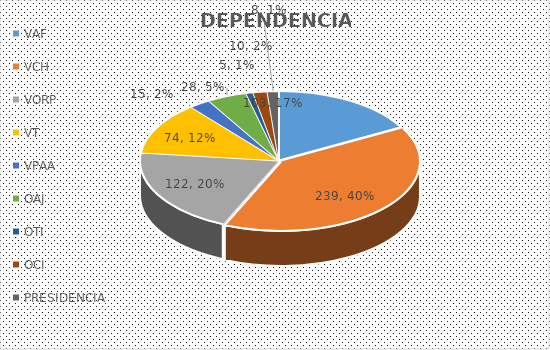
| Category | CANTIDAD |
|---|---|
| VAF | 103 |
| VCH | 239 |
| VORP | 122 |
| VT | 74 |
| VPAA | 15 |
| OAJ | 28 |
| OTI | 5 |
| OCI | 10 |
| PRESIDENCIA  | 8 |